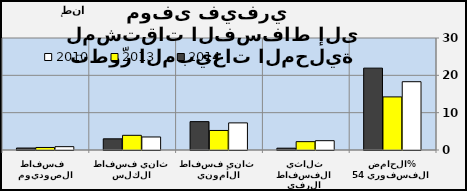
| Category | 2010 | 2013 | 2014 |
|---|---|---|---|
| الحامض الفسفوري 54% | 18.292 | 14.222 | 21.928 |
| ثلاثي الفسفاط الرفيع | 2.496 | 2.236 | 0.488 |
| ثاني فسفاط الأمونيا | 7.265 | 5.232 | 7.6 |
| ثاني فسفاط الكلس | 3.487 | 3.933 | 2.994 |
| فسفاط الصوديوم  | 0.895 | 0.676 | 0.524 |